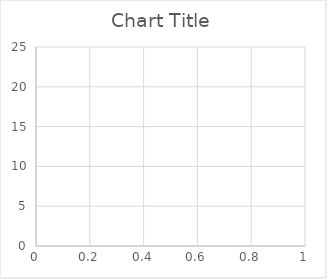
| Category | Series 0 |
|---|---|
| 0 | 3.346 |
| 1 | 0.444 |
| 2 | 0.538 |
| 3 | 2.699 |
| 4 | 3.195 |
| 5 | 0.457 |
| 6 | 0.49 |
| 7 | 1.092 |
| 8 | 0.644 |
| 9 | 0.376 |
| 10 | 1.06 |
| 11 | 2.486 |
| 12 | 0.414 |
| 13 | 0.824 |
| 14 | 0.914 |
| 15 | 0.338 |
| 16 | 0.984 |
| 17 | 1.357 |
| 18 | 0.453 |
| 19 | 4.31 |
| 20 | 1.131 |
| 21 | 20.916 |
| 22 | 0.55 |
| 23 | 0.102 |
| 24 | 0.663 |
| 25 | 0.65 |
| 26 | 0.513 |
| 27 | 0.874 |
| 28 | 0.944 |
| 29 | 3.019 |
| 30 | 0.49 |
| 31 | 1.042 |
| 32 | 2.14 |
| 33 | 0.517 |
| 34 | 0.931 |
| 35 | 0.818 |
| 36 | 0.811 |
| 37 | 0.357 |
| 38 | 0.594 |
| 39 | 2.186 |
| 40 | 2.422 |
| 41 | 0.364 |
| 42 | 0.454 |
| 43 | 2.349 |
| 44 | 2.715 |
| 45 | 0.436 |
| 46 | 2.05 |
| 47 | 1.271 |
| 48 | 0.406 |
| 49 | 0.668 |
| 50 | 1.458 |
| 51 | 0.951 |
| 52 | 7.188 |
| 53 | 0.563 |
| 54 | 0.528 |
| 55 | 2.051 |
| 56 | 0.343 |
| 57 | 0.463 |
| 58 | 0.439 |
| 59 | 0.551 |
| 60 | 0.501 |
| 61 | 0.495 |
| 62 | 0.519 |
| 63 | 0.366 |
| 64 | 0.594 |
| 65 | 0.483 |
| 66 | 0.721 |
| 67 | 0.608 |
| 68 | 0.907 |
| 69 | 0.421 |
| 70 | 0.522 |
| 71 | 0 |
| 72 | 0.907 |
| 73 | 0.429 |
| 74 | 0.58 |
| 75 | 0.506 |
| 76 | 1.135 |
| 77 | 0.852 |
| 78 | 0.719 |
| 79 | 0.861 |
| 80 | 0.463 |
| 81 | 5.668 |
| 82 | 0.453 |
| 83 | 2.211 |
| 84 | 0 |
| 85 | 0.59 |
| 86 | 1.432 |
| 87 | 0.428 |
| 88 | 0.689 |
| 89 | 0.51 |
| 90 | 0.486 |
| 91 | 0.399 |
| 92 | 0.261 |
| 93 | 0.405 |
| 94 | 0.46 |
| 95 | 0.431 |
| 96 | 0.319 |
| 97 | 0.408 |
| 98 | 0.418 |
| 99 | 0.45 |
| 100 | 0.671 |
| 101 | 0.413 |
| 102 | 0.403 |
| 103 | 0.521 |
| 104 | 0.453 |
| 105 | 0.358 |
| 106 | 0.428 |
| 107 | 0.46 |
| 108 | 0.56 |
| 109 | 0.409 |
| 110 | 0.47 |
| 111 | 0.474 |
| 112 | 0.31 |
| 113 | 0.488 |
| 114 | 0.404 |
| 115 | 0.358 |
| 116 | 0.377 |
| 117 | 0.378 |
| 118 | 0.445 |
| 119 | 0.432 |
| 120 | 0.413 |
| 121 | 0.435 |
| 122 | 0.444 |
| 123 | 0.403 |
| 124 | 0.377 |
| 125 | 0.482 |
| 126 | 0.505 |
| 127 | 0.524 |
| 128 | 0.364 |
| 129 | 0.509 |
| 130 | 2.141 |
| 131 | 0.515 |
| 132 | 0.293 |
| 133 | 2.486 |
| 134 | 0.483 |
| 135 | 0.447 |
| 136 | 0.301 |
| 137 | 2.002 |
| 138 | 0.321 |
| 139 | 0.357 |
| 140 | 0.333 |
| 141 | 0.659 |
| 142 | 0.404 |
| 143 | 0.441 |
| 144 | 1.678 |
| 145 | 0.421 |
| 146 | 0.339 |
| 147 | 0.404 |
| 148 | 0.391 |
| 149 | 0.338 |
| 150 | 0.585 |
| 151 | 0.467 |
| 152 | 0.557 |
| 153 | 0.387 |
| 154 | 0.729 |
| 155 | 0.456 |
| 156 | 0.462 |
| 157 | 0.385 |
| 158 | 0.605 |
| 159 | 0.505 |
| 160 | 0.483 |
| 161 | 0.335 |
| 162 | 0.607 |
| 163 | 0.54 |
| 164 | 0.424 |
| 165 | 0.326 |
| 166 | 1.286 |
| 167 | 0.439 |
| 168 | 0.536 |
| 169 | 0.341 |
| 170 | 0.369 |
| 171 | 0.398 |
| 172 | 0.545 |
| 173 | 0.42 |
| 174 | 0.406 |
| 175 | 0.443 |
| 176 | 0.473 |
| 177 | 0.426 |
| 178 | 0.301 |
| 179 | 0.347 |
| 180 | 0.394 |
| 181 | 0.449 |
| 182 | 0.347 |
| 183 | 0.344 |
| 184 | 0.38 |
| 185 | 0.329 |
| 186 | 0.493 |
| 187 | 0.293 |
| 188 | 0.378 |
| 189 | 0.518 |
| 190 | 0.441 |
| 191 | 0.32 |
| 192 | 0.443 |
| 193 | 0.424 |
| 194 | 0.433 |
| 195 | 0.353 |
| 196 | 0.619 |
| 197 | 0.503 |
| 198 | 0.468 |
| 199 | 0.34 |
| 200 | 0.43 |
| 201 | 0.528 |
| 202 | 0.42 |
| 203 | 0.329 |
| 204 | 0.639 |
| 205 | 0.447 |
| 206 | 0.608 |
| 207 | 0.37 |
| 208 | 0.401 |
| 209 | 0.422 |
| 210 | 0.405 |
| 211 | 0.446 |
| 212 | 0.382 |
| 213 | 0.5 |
| 214 | 0.485 |
| 215 | 0.353 |
| 216 | 0.78 |
| 217 | 0.59 |
| 218 | 0.407 |
| 219 | 0.357 |
| 220 | 0.482 |
| 221 | 0.425 |
| 222 | 0.42 |
| 223 | 0.348 |
| 224 | 0.567 |
| 225 | 0.49 |
| 226 | 0.508 |
| 227 | 0.339 |
| 228 | 0.546 |
| 229 | 0.552 |
| 230 | 0.636 |
| 231 | 0.398 |
| 232 | 0.411 |
| 233 | 0.57 |
| 234 | 0.481 |
| 235 | 0.367 |
| 236 | 0.768 |
| 237 | 0.533 |
| 238 | 0.45 |
| 239 | 0.314 |
| 240 | 0.506 |
| 241 | 0.571 |
| 242 | 0.377 |
| 243 | 0.366 |
| 244 | 0.471 |
| 245 | 0.499 |
| 246 | 0.515 |
| 247 | 0.38 |
| 248 | 0.466 |
| 249 | 0.403 |
| 250 | 0.54 |
| 251 | 0.305 |
| 252 | 0.588 |
| 253 | 0.528 |
| 254 | 0.526 |
| 255 | 0.385 |
| 256 | 0.501 |
| 257 | 0.567 |
| 258 | 0.555 |
| 259 | 0.367 |
| 260 | 0.335 |
| 261 | 0.501 |
| 262 | 0.726 |
| 263 | 0.425 |
| 264 | 0.634 |
| 265 | 0.624 |
| 266 | 0.521 |
| 267 | 0.435 |
| 268 | 0.489 |
| 269 | 0.527 |
| 270 | 0.547 |
| 271 | 0.366 |
| 272 | 0.51 |
| 273 | 0.548 |
| 274 | 0.54 |
| 275 | 0.367 |
| 276 | 0.405 |
| 277 | 0.439 |
| 278 | 0.587 |
| 279 | 0.325 |
| 280 | 0.432 |
| 281 | 0.728 |
| 282 | 0.569 |
| 283 | 0.389 |
| 284 | 0.528 |
| 285 | 0.536 |
| 286 | 0.567 |
| 287 | 0.35 |
| 288 | 0.698 |
| 289 | 0.406 |
| 290 | 0.768 |
| 291 | 0.339 |
| 292 | 0.376 |
| 293 | 0.525 |
| 294 | 0.425 |
| 295 | 0.355 |
| 296 | 0.476 |
| 297 | 0.5 |
| 298 | 0.559 |
| 299 | 0.382 |
| 300 | 1.002 |
| 301 | 0.357 |
| 302 | 0.371 |
| 303 | 0.323 |
| 304 | 0.437 |
| 305 | 0.387 |
| 306 | 0.365 |
| 307 | 0.359 |
| 308 | 0.504 |
| 309 | 0.389 |
| 310 | 0.441 |
| 311 | 0.363 |
| 312 | 0.398 |
| 313 | 0.495 |
| 314 | 0.518 |
| 315 | 0.361 |
| 316 | 0.431 |
| 317 | 0.482 |
| 318 | 0.401 |
| 319 | 0.326 |
| 320 | 0.378 |
| 321 | 0.373 |
| 322 | 0.387 |
| 323 | 0.268 |
| 324 | 0.414 |
| 325 | 0.514 |
| 326 | 0.507 |
| 327 | 0.32 |
| 328 | 0.461 |
| 329 | 0.517 |
| 330 | 0.556 |
| 331 | 0.465 |
| 332 | 0.414 |
| 333 | 0.367 |
| 334 | 0.437 |
| 335 | 0.344 |
| 336 | 0.381 |
| 337 | 0.312 |
| 338 | 0.707 |
| 339 | 0.513 |
| 340 | 0.363 |
| 341 | 0.406 |
| 342 | 0.383 |
| 343 | 0.696 |
| 344 | 0.404 |
| 345 | 0.369 |
| 346 | 0.439 |
| 347 | 0.542 |
| 348 | 0.489 |
| 349 | 0.415 |
| 350 | 0.53 |
| 351 | 0.561 |
| 352 | 0.401 |
| 353 | 0.362 |
| 354 | 0.305 |
| 355 | 0.565 |
| 356 | 0.405 |
| 357 | 0.523 |
| 358 | 0.284 |
| 359 | 0.699 |
| 360 | 0.456 |
| 361 | 0 |
| 362 | 0.289 |
| 363 | 0.367 |
| 364 | 0.267 |
| 365 | 0.52 |
| 366 | 0.507 |
| 367 | 0.375 |
| 368 | 0.516 |
| 369 | 0.602 |
| 370 | 0.626 |
| 371 | 0.457 |
| 372 | 0.357 |
| 373 | 0.527 |
| 374 | 0.429 |
| 375 | 0.435 |
| 376 | 0.396 |
| 377 | 0.372 |
| 378 | 0.358 |
| 379 | 0.565 |
| 380 | 0.371 |
| 381 | 0.382 |
| 382 | 0.321 |
| 383 | 0.532 |
| 384 | 0.406 |
| 385 | 0.437 |
| 386 | 0.341 |
| 387 | 0.649 |
| 388 | 0.482 |
| 389 | 0.388 |
| 390 | 0.285 |
| 391 | 0.547 |
| 392 | 0.424 |
| 393 | 0.37 |
| 394 | 0.36 |
| 395 | 0.546 |
| 396 | 0.394 |
| 397 | 0.468 |
| 398 | 0.353 |
| 399 | 0.418 |
| 400 | 0.366 |
| 401 | 0.388 |
| 402 | 0.369 |
| 403 | 0.499 |
| 404 | 0.341 |
| 405 | 0.406 |
| 406 | 0.303 |
| 407 | 0.615 |
| 408 | 0.404 |
| 409 | 0.38 |
| 410 | 0.275 |
| 411 | 0.618 |
| 412 | 0.398 |
| 413 | 0.454 |
| 414 | 0.294 |
| 415 | 0.645 |
| 416 | 0.37 |
| 417 | 0.407 |
| 418 | 0.296 |
| 419 | 0.52 |
| 420 | 0.383 |
| 421 | 0.363 |
| 422 | 0.338 |
| 423 | 0.596 |
| 424 | 0.515 |
| 425 | 0.37 |
| 426 | 0.413 |
| 427 | 0.56 |